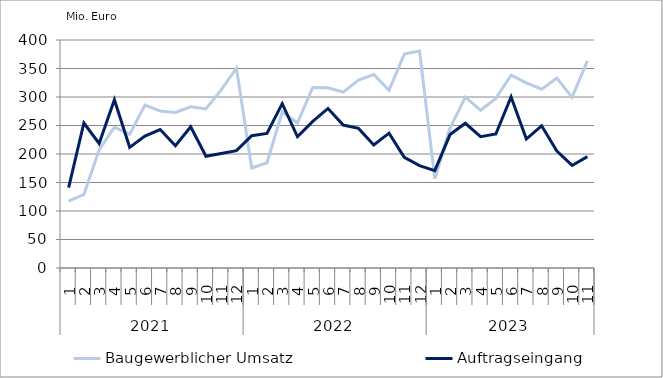
| Category | Baugewerblicher Umsatz | Auftragseingang |
|---|---|---|
| 0 | 117421.805 | 141020.655 |
| 1 | 129162.55 | 254416.876 |
| 2 | 207280.837 | 218451.405 |
| 3 | 247094.279 | 295077.868 |
| 4 | 234515.312 | 211696.129 |
| 5 | 285732.845 | 231455.155 |
| 6 | 275480.885 | 242932.505 |
| 7 | 272787.524 | 214636.944 |
| 8 | 282850.254 | 247827.991 |
| 9 | 279173.21 | 196069.238 |
| 10 | 312511.437 | 201015.897 |
| 11 | 350582.01 | 205949.991 |
| 12 | 175456.852 | 232178.255 |
| 13 | 184578.32 | 236006.862 |
| 14 | 273732.567 | 288451.109 |
| 15 | 254683.671 | 230228.968 |
| 16 | 316794.568 | 257235.39 |
| 17 | 316277.567 | 279900.179 |
| 18 | 308621.034 | 250827.343 |
| 19 | 329490.411 | 244949.341 |
| 20 | 339435.208 | 215809.075 |
| 21 | 311599.811 | 236674.056 |
| 22 | 375203.994 | 194107.214 |
| 23 | 380445.583 | 179631.624 |
| 24 | 156885.157 | 170764.939 |
| 25 | 245647.016 | 234064.391 |
| 26 | 299793.904 | 253873.168 |
| 27 | 276653.498 | 230304.701 |
| 28 | 297513.239 | 235047.978 |
| 29 | 338296.53 | 299989.264 |
| 30 | 324660.651 | 226217.704 |
| 31 | 313657.31 | 249461.868 |
| 32 | 333301.685 | 205148.229 |
| 33 | 299264.813 | 179932.548 |
| 34 | 363340.927 | 195334.324 |